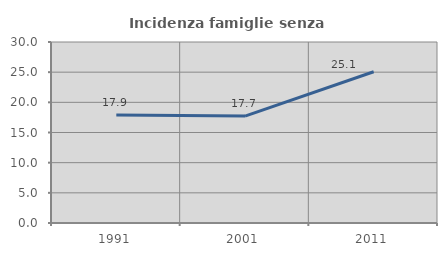
| Category | Incidenza famiglie senza nuclei |
|---|---|
| 1991.0 | 17.913 |
| 2001.0 | 17.715 |
| 2011.0 | 25.072 |